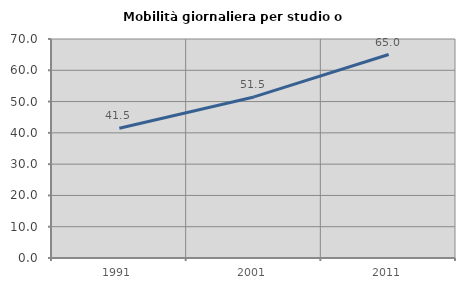
| Category | Mobilità giornaliera per studio o lavoro |
|---|---|
| 1991.0 | 41.481 |
| 2001.0 | 51.485 |
| 2011.0 | 65.035 |